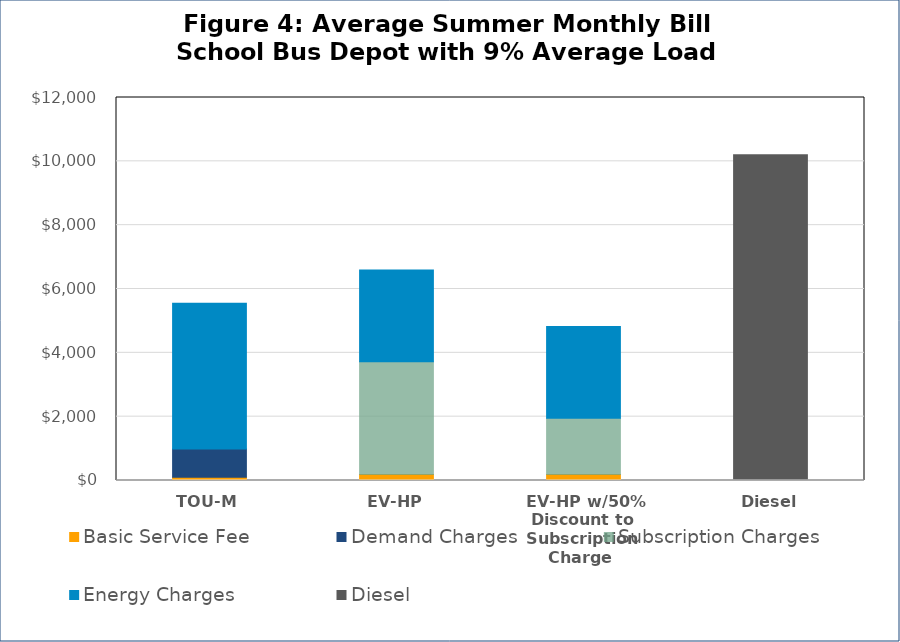
| Category | Basic Service Fee | Demand Charges | Subscription Charges | Energy Charges | Diesel |
|---|---|---|---|---|---|
|  TOU-M  | 101.56 | 888 | 0 | 4563.282 | 0 |
|  EV-HP  | 186.304 | 0 | 3534.15 | 2873.593 | 0 |
|  EV-HP w/50% Discount to Subscription Charge  | 186.304 | 0 | 1767.075 | 2873.593 | 0 |
|  Diesel  | 0 | 0 | 0 | 0 | 10207.833 |